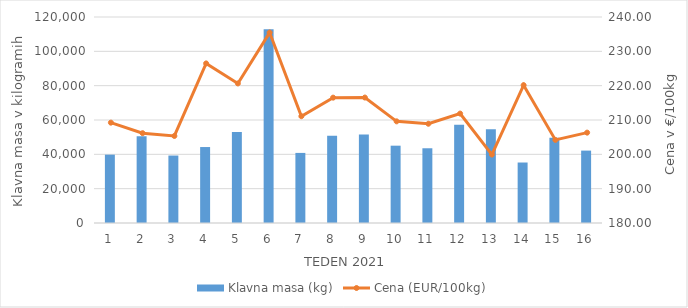
| Category | Klavna masa (kg) |
|---|---|
| 1.0 | 39814 |
| 2.0 | 50603 |
| 3.0 | 39295 |
| 4.0 | 44250 |
| 5.0 | 53061 |
| 6.0 | 112816 |
| 7.0 | 40829 |
| 8.0 | 50775 |
| 9.0 | 51535 |
| 10.0 | 45040 |
| 11.0 | 43536 |
| 12.0 | 57246 |
| 13.0 | 54680 |
| 14.0 | 35237 |
| 15.0 | 49721 |
| 16.0 | 42177 |